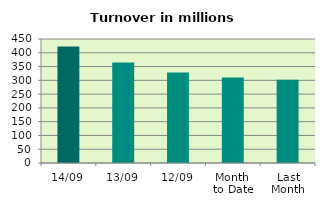
| Category | Series 0 |
|---|---|
| 14/09 | 423.022 |
| 13/09 | 364.366 |
| 12/09 | 328.195 |
| Month 
to Date | 309.835 |
| Last
Month | 301.741 |